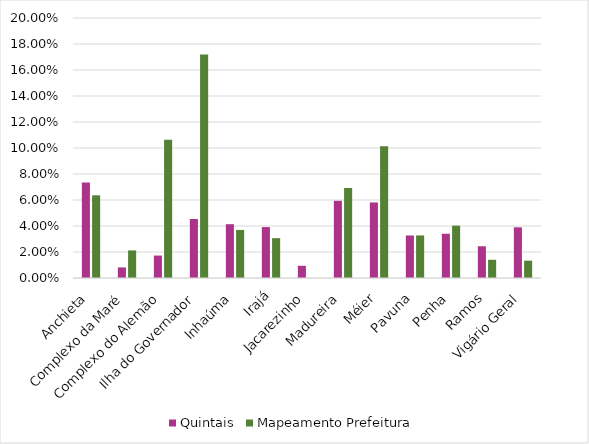
| Category | Quintais | Mapeamento Prefeitura |
|---|---|---|
| Anchieta | 0.073 | 0.064 |
| Complexo da Maré | 0.008 | 0.021 |
| Complexo do Alemão | 0.017 | 0.106 |
| Ilha do Governador | 0.045 | 0.172 |
| Inhaúma | 0.041 | 0.037 |
| Irajá | 0.039 | 0.031 |
| Jacarezinho | 0.009 | 0 |
| Madureira | 0.059 | 0.069 |
| Méier | 0.058 | 0.101 |
| Pavuna | 0.033 | 0.033 |
| Penha | 0.034 | 0.04 |
| Ramos | 0.024 | 0.014 |
| Vigário Geral | 0.039 | 0.013 |